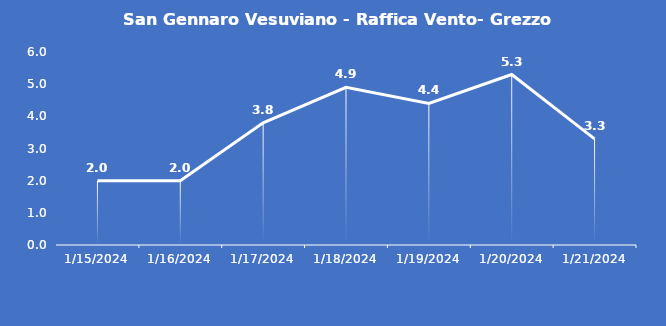
| Category | San Gennaro Vesuviano - Raffica Vento- Grezzo (m/s) |
|---|---|
| 1/15/24 | 2 |
| 1/16/24 | 2 |
| 1/17/24 | 3.8 |
| 1/18/24 | 4.9 |
| 1/19/24 | 4.4 |
| 1/20/24 | 5.3 |
| 1/21/24 | 3.3 |